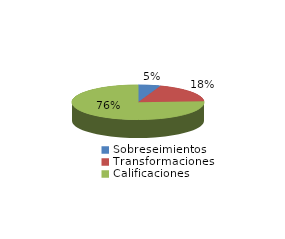
| Category | Series 0 |
|---|---|
| Sobreseimientos | 33 |
| Transformaciones | 111 |
| Calificaciones | 457 |